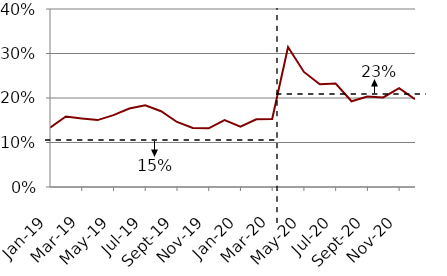
| Category | Series 0 |
|---|---|
| 2019-01-01 | 0.133 |
| 2019-02-01 | 0.158 |
| 2019-03-01 | 0.154 |
| 2019-04-01 | 0.15 |
| 2019-05-01 | 0.161 |
| 2019-06-01 | 0.176 |
| 2019-07-01 | 0.184 |
| 2019-08-01 | 0.17 |
| 2019-09-01 | 0.146 |
| 2019-10-01 | 0.133 |
| 2019-11-01 | 0.132 |
| 2019-12-01 | 0.15 |
| 2020-01-01 | 0.136 |
| 2020-02-01 | 0.152 |
| 2020-03-01 | 0.153 |
| 2020-04-01 | 0.315 |
| 2020-05-01 | 0.259 |
| 2020-06-01 | 0.231 |
| 2020-07-01 | 0.233 |
| 2020-08-01 | 0.193 |
| 2020-09-01 | 0.203 |
| 2020-10-01 | 0.201 |
| 2020-11-01 | 0.222 |
| 2020-12-01 | 0.197 |